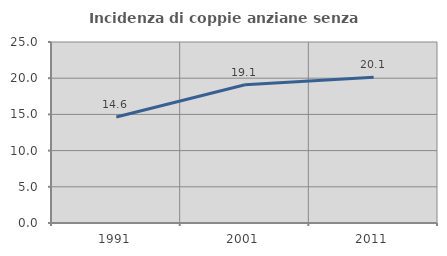
| Category | Incidenza di coppie anziane senza figli  |
|---|---|
| 1991.0 | 14.636 |
| 2001.0 | 19.095 |
| 2011.0 | 20.147 |